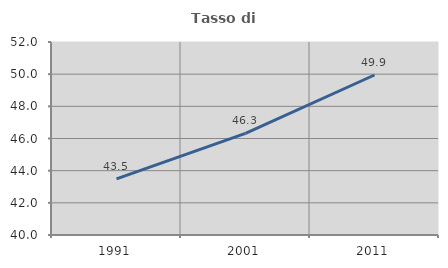
| Category | Tasso di occupazione   |
|---|---|
| 1991.0 | 43.491 |
| 2001.0 | 46.324 |
| 2011.0 | 49.948 |